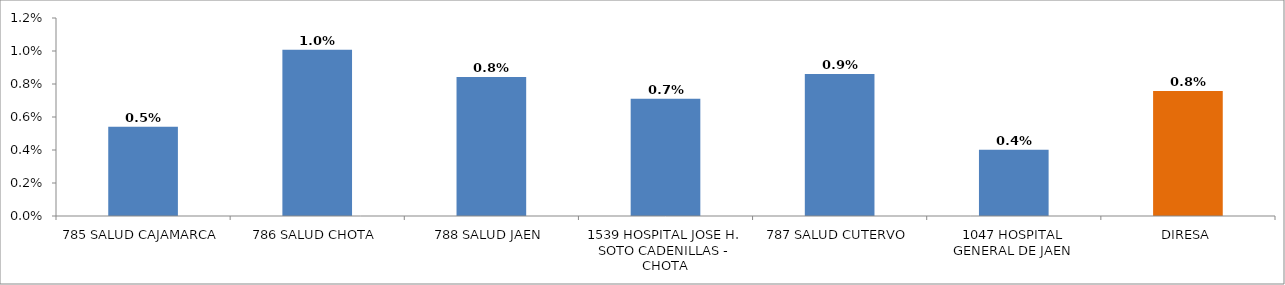
| Category | % PAREJAS PROTEGIDAS PPFF 
(QUINTIL 1 Y 2) |
|---|---|
| 785 SALUD CAJAMARCA | 0.005 |
| 786 SALUD CHOTA | 0.01 |
| 788 SALUD JAEN | 0.008 |
| 1539 HOSPITAL JOSE H. SOTO CADENILLAS - CHOTA | 0.007 |
| 787 SALUD CUTERVO | 0.009 |
| 1047 HOSPITAL GENERAL DE JAEN | 0.004 |
| DIRESA | 0.008 |